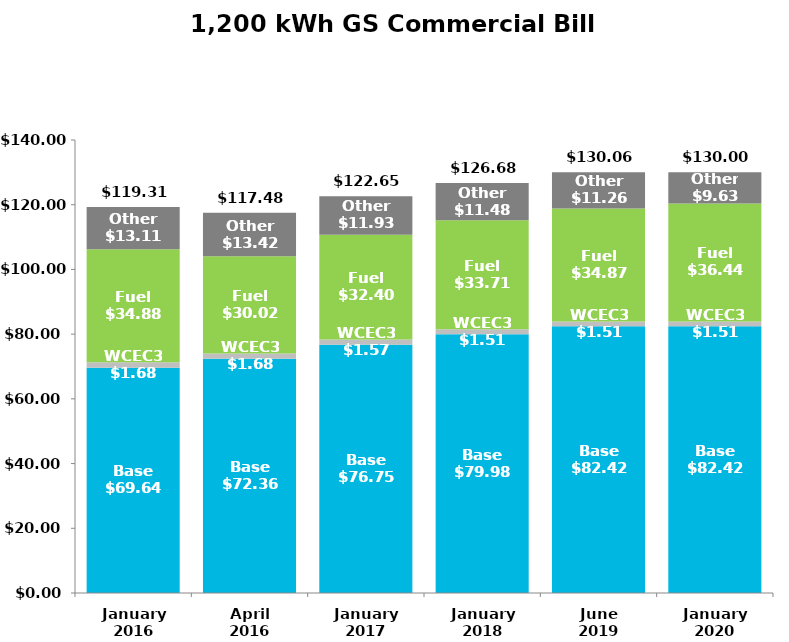
| Category | Base | WCEC3 | Fuel | Other |
|---|---|---|---|---|
| January
2016 | 69.64 | 1.68 | 34.88 | 13.11 |
| April
2016 | 72.36 | 1.68 | 30.02 | 13.42 |
| January
2017 | 76.75 | 1.57 | 32.4 | 11.93 |
| January
2018 | 79.98 | 1.51 | 33.71 | 11.48 |
| June
2019 | 82.42 | 1.51 | 34.87 | 11.26 |
| January
2020 | 82.42 | 1.51 | 36.44 | 9.63 |